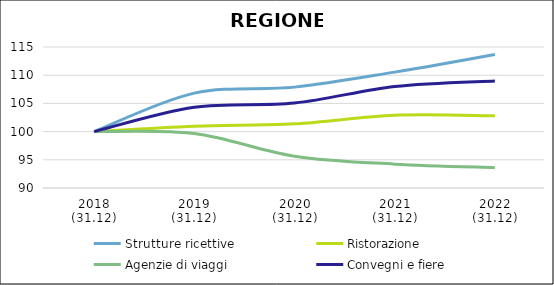
| Category | Strutture ricettive | Ristorazione | Agenzie di viaggi | Convegni e fiere |
|---|---|---|---|---|
| 2018
(31.12) | 100 | 100 | 100 | 100 |
| 2019
(31.12) | 106.816 | 100.964 | 99.651 | 104.322 |
| 2020
(31.12) | 107.886 | 101.371 | 95.625 | 105.067 |
| 2021
(31.12) | 110.545 | 102.888 | 94.23 | 107.998 |
| 2022
(31.12) | 113.673 | 102.794 | 93.612 | 108.992 |